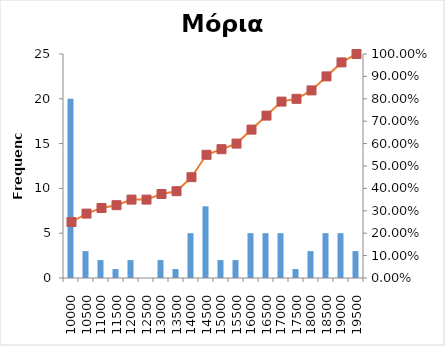
| Category | Series 0 |
|---|---|
| 10000 | 20 |
| 10500 | 3 |
| 11000 | 2 |
| 11500 | 1 |
| 12000 | 2 |
| 12500 | 0 |
| 13000 | 2 |
| 13500 | 1 |
| 14000 | 5 |
| 14500 | 8 |
| 15000 | 2 |
| 15500 | 2 |
| 16000 | 5 |
| 16500 | 5 |
| 17000 | 5 |
| 17500 | 1 |
| 18000 | 3 |
| 18500 | 5 |
| 19000 | 5 |
| 19500 | 3 |